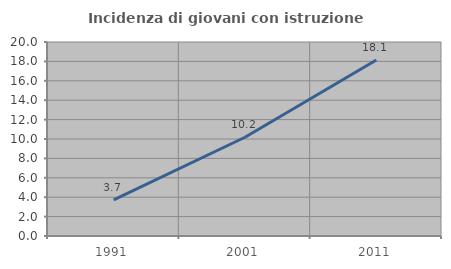
| Category | Incidenza di giovani con istruzione universitaria |
|---|---|
| 1991.0 | 3.719 |
| 2001.0 | 10.182 |
| 2011.0 | 18.137 |